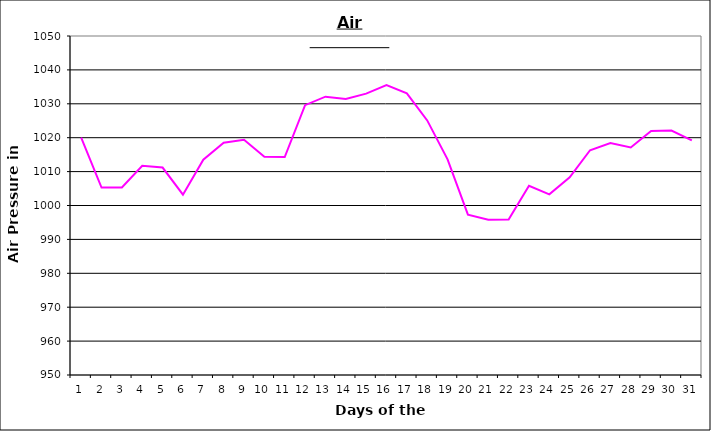
| Category | Series 0 |
|---|---|
| 0 | 1020 |
| 1 | 1005.3 |
| 2 | 1005.3 |
| 3 | 1011.7 |
| 4 | 1011.2 |
| 5 | 1003.2 |
| 6 | 1013.5 |
| 7 | 1018.5 |
| 8 | 1019.4 |
| 9 | 1014.4 |
| 10 | 1014.3 |
| 11 | 1029.6 |
| 12 | 1032.1 |
| 13 | 1031.4 |
| 14 | 1033 |
| 15 | 1035.5 |
| 16 | 1033.1 |
| 17 | 1025.1 |
| 18 | 1013.6 |
| 19 | 997.3 |
| 20 | 995.8 |
| 21 | 995.9 |
| 22 | 1005.8 |
| 23 | 1003.3 |
| 24 | 1008.3 |
| 25 | 1016.3 |
| 26 | 1018.4 |
| 27 | 1017.1 |
| 28 | 1022 |
| 29 | 1022.1 |
| 30 | 1019.2 |